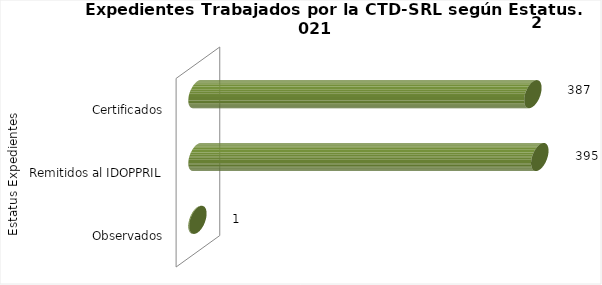
| Category | Total |
|---|---|
| 0 | 1 |
| 1 | 395 |
| 2 | 387 |